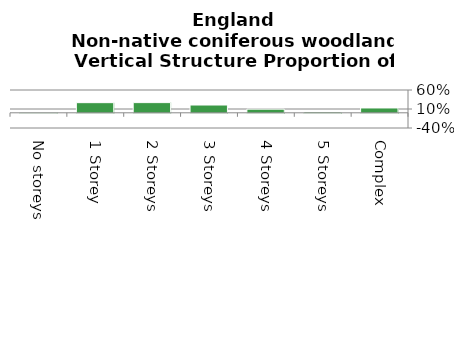
| Category | Non-native coniferous woodland |
|---|---|
| No storeys | 0.014 |
| 1 Storey | 0.267 |
| 2 Storeys | 0.268 |
| 3 Storeys | 0.205 |
| 4 Storeys | 0.096 |
| 5 Storeys | 0.023 |
| Complex | 0.127 |